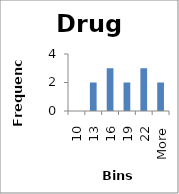
| Category | Frequency |
|---|---|
| 10 | 0 |
| 13 | 2 |
| 16 | 3 |
| 19 | 2 |
| 22 | 3 |
| More | 2 |